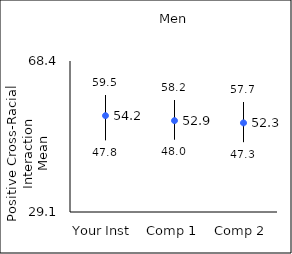
| Category | 25th percentile | 75th percentile | Mean |
|---|---|---|---|
| Your Inst | 47.8 | 59.5 | 54.17 |
| Comp 1 | 48 | 58.2 | 52.88 |
| Comp 2 | 47.3 | 57.7 | 52.29 |